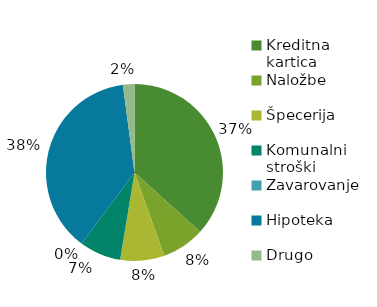
| Category | Skupaj |
|---|---|
| Kreditna kartica | 936.48 |
| Naložbe | 200 |
| Špecerija | 205.61 |
| Komunalni stroški | 194.2 |
| Zavarovanje | 0 |
| Hipoteka | 961.77 |
| Drugo | 53.65 |